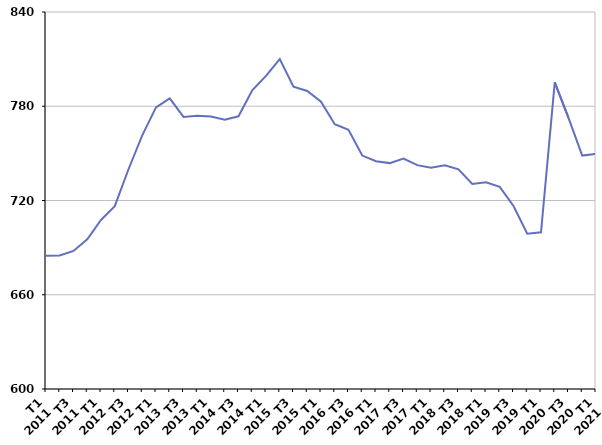
| Category | Moins de 25 ans |
|---|---|
| T1
2011 | 684.9 |
| T2
2011 | 685 |
| T3
2011 | 687.9 |
| T4
2011 | 695.3 |
| T1
2012 | 707.6 |
| T2
2012 | 716.4 |
| T3
2012 | 739.9 |
| T4
2012 | 761.5 |
| T1
2013 | 779.3 |
| T2
2013 | 785 |
| T3
2013 | 773.2 |
| T4
2013 | 773.9 |
| T1
2014 | 773.4 |
| T2
2014 | 771.4 |
| T3
2014 | 773.6 |
| T4
2014 | 790.2 |
| T1
2015 | 799.3 |
| T2
2015 | 810 |
| T3
2015 | 792.5 |
| T4
2015 | 789.7 |
| T1
2016 | 782.9 |
| T2
2016 | 768.6 |
| T3
2016 | 765 |
| T4
2016 | 748.6 |
| T1
2017 | 745 |
| T2
2017 | 743.8 |
| T3
2017 | 746.7 |
| T4
2017 | 742.5 |
| T1
2018 | 740.9 |
| T2
2018 | 742.4 |
| T3
2018 | 739.8 |
| T4
2018 | 730.5 |
| T1
2019 | 731.6 |
| T2
2019 | 728.7 |
| T3
2019 | 716.5 |
| T4
2019 | 698.8 |
| T1
2020 | 699.8 |
| T2
2020 | 795.2 |
| T3
2020 | 772.6 |
| T4
2020 | 748.6 |
| T1
2021 | 749.7 |